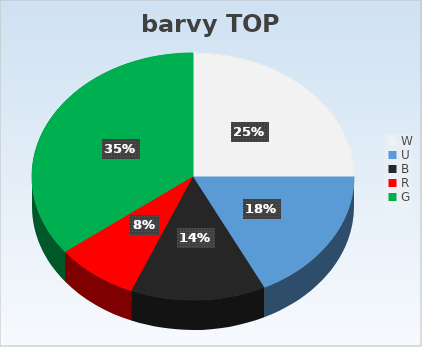
| Category | Series 0 |
|---|---|
| W | 4 |
| U | 2.833 |
| B | 2.167 |
| R | 1.333 |
| G | 5.667 |